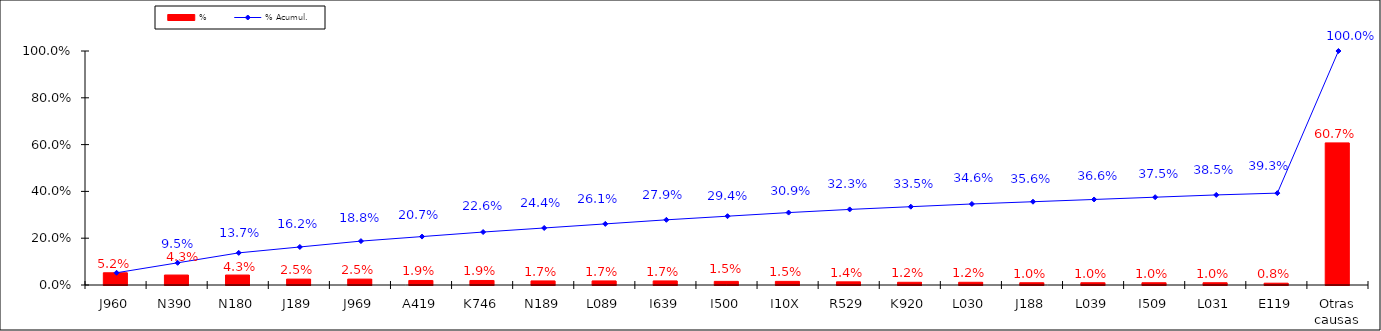
| Category | % |
|---|---|
| J960 | 0.052 |
| N390 | 0.043 |
| N180 | 0.043 |
| J189 | 0.025 |
| J969 | 0.025 |
| A419 | 0.019 |
| K746 | 0.019 |
| N189 | 0.017 |
| L089 | 0.017 |
| I639 | 0.017 |
| I500 | 0.015 |
| I10X | 0.015 |
| R529 | 0.014 |
| K920 | 0.012 |
| L030 | 0.012 |
| J188 | 0.01 |
| L039 | 0.01 |
| I509 | 0.01 |
| L031 | 0.01 |
| E119 | 0.008 |
| Otras causas | 0.607 |